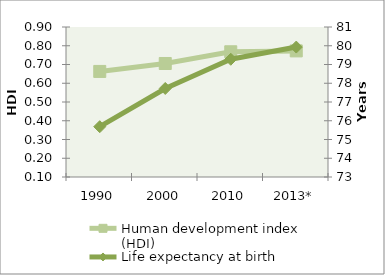
| Category | Human development index (HDI) |
|---|---|
| 1990 | 0.663 |
| 2000 | 0.705 |
| 2010 | 0.768 |
| 2013* | 0.773 |